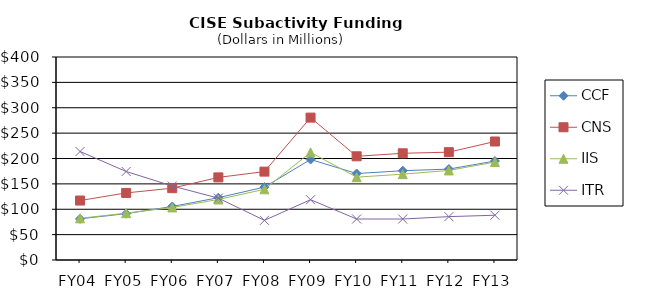
| Category | CCF | CNS | IIS | ITR |
|---|---|---|---|---|
| FY04 | 81.15 | 117.15 | 82.15 | 213.77 |
| FY05 | 91.29 | 132.17 | 92.31 | 174.43 |
| FY06 | 105.46 | 141.53 | 103.62 | 145.8 |
| FY07 | 122.76 | 162.77 | 119.25 | 121.9 |
| FY08 | 143.63 | 174.16 | 139.33 | 78.14 |
| FY09 | 198.09 | 280.55 | 212.1 | 118.76 |
| FY10 | 170.398 | 204.325 | 163.213 | 80.779 |
| FY11 | 175.932 | 210.258 | 169.143 | 80.73 |
| FY12 | 179.13 | 212.5 | 176.5 | 85.46 |
| FY13 | 195 | 233.5 | 193 | 88.22 |